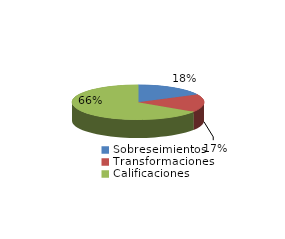
| Category | Series 0 |
|---|---|
| Sobreseimientos | 500 |
| Transformaciones | 470 |
| Calificaciones | 1871 |